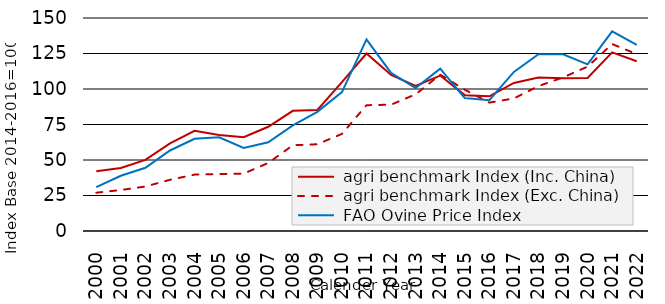
| Category |  agri benchmark Index (Inc. China) |  agri benchmark Index (Exc. China) |  FAO Ovine Price Index |
|---|---|---|---|
| 2000.0 | 42.001 | 26.966 | 30.939 |
| 2001.0 | 44.332 | 28.875 | 38.911 |
| 2002.0 | 50.076 | 31.331 | 44.531 |
| 2003.0 | 61.757 | 36.051 | 56.701 |
| 2004.0 | 70.507 | 39.71 | 64.938 |
| 2005.0 | 67.564 | 40.13 | 65.95 |
| 2006.0 | 66.02 | 40.43 | 58.554 |
| 2007.0 | 73.418 | 47.902 | 62.525 |
| 2008.0 | 84.615 | 60.37 | 74.374 |
| 2009.0 | 85.199 | 61.106 | 83.899 |
| 2010.0 | 104.792 | 68.38 | 97.78 |
| 2011.0 | 125.007 | 88.592 | 134.9 |
| 2012.0 | 109.905 | 88.957 | 111.309 |
| 2013.0 | 102.219 | 96.252 | 100.607 |
| 2014.0 | 109.482 | 110.081 | 114.317 |
| 2015.0 | 95.671 | 99.503 | 93.625 |
| 2016.0 | 94.847 | 90.415 | 92.058 |
| 2017.0 | 104.267 | 93.349 | 112.025 |
| 2018.0 | 108.16 | 102.064 | 124.475 |
| 2019.0 | 107.521 | 108.129 | 124.494 |
| 2020.0 | 107.76 | 115.761 | 117.341 |
| 2021.0 | 125.783 | 131.659 | 140.563 |
| 2022.0 | 119.565 | 124.579 | 131.07 |